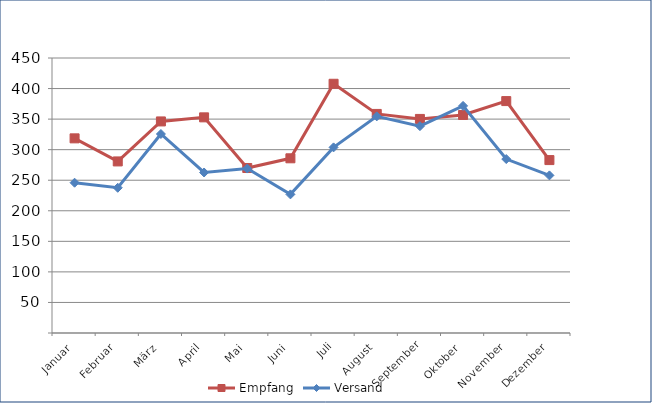
| Category | Empfang | Versand |
|---|---|---|
| Januar | 318.526 | 245.926 |
| Februar | 280.759 | 237.641 |
| März | 346.199 | 325.661 |
| April | 352.884 | 262.658 |
| Mai | 270.011 | 269.084 |
| Juni | 285.852 | 226.84 |
| Juli | 407.833 | 303.726 |
| August | 358.488 | 354.483 |
| September | 350.289 | 338.463 |
| Oktober | 356.799 | 371.623 |
| November | 379.506 | 284.639 |
| Dezember | 282.948 | 257.885 |